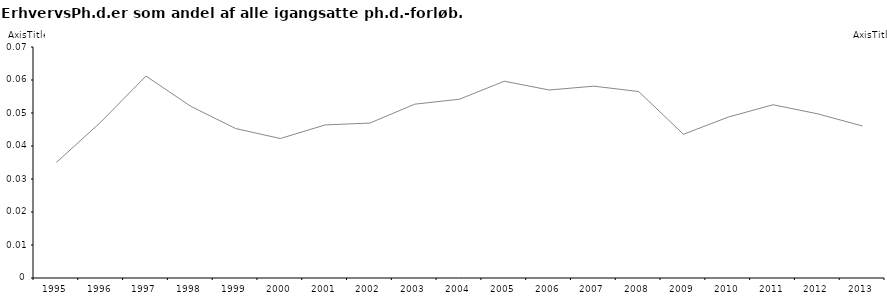
| Category | ErhvervsPhD-andelen |
|---|---|
| 1995 | 0.035 |
| 1996 | 0.047 |
| 1997 | 0.061 |
| 1998 | 0.052 |
| 1999 | 0.045 |
| 2000 | 0.042 |
| 2001 | 0.046 |
| 2002 | 0.047 |
| 2003 | 0.053 |
| 2004 | 0.054 |
| 2005 | 0.06 |
| 2006 | 0.057 |
| 2007 | 0.058 |
| 2008 | 0.057 |
| 2009 | 0.044 |
| 2010 | 0.049 |
| 2011 | 0.053 |
| 2012 | 0.05 |
| 2013 | 0.046 |